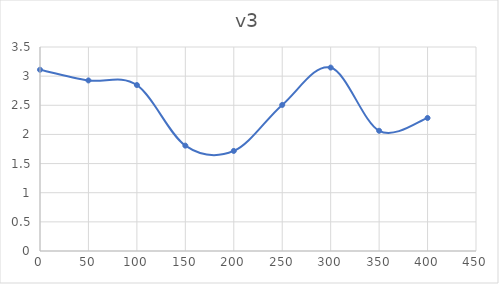
| Category | Series 0 |
|---|---|
| 0.0 | 3.11 |
| 50.0 | 2.926 |
| 100.0 | 2.847 |
| 150.0 | 1.808 |
| 200.0 | 1.717 |
| 250.0 | 2.506 |
| 300.0 | 3.147 |
| 350.0 | 2.063 |
| 400.0 | 2.282 |